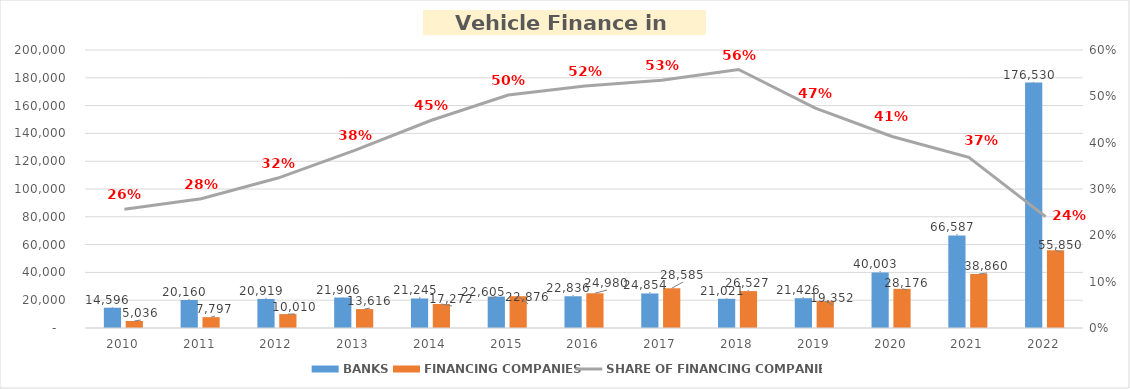
| Category | BANKS | FINANCING COMPANIES |
|---|---|---|
| 2010 | 14595.746 | 5035.89 |
| 2011 | 20160.143 | 7796.854 |
| 2012 | 20919.143 | 10009.755 |
| 2013 | 21905.99 | 13616.036 |
| 2014 | 21244.953 | 17271.844 |
| 2015 | 22605.033 | 22875.563 |
| 2016 | 22835.961 | 24980.231 |
| 2017 | 24853.571 | 28584.938 |
| 2018 | 21021.01 | 26527.133 |
| 2019 | 21426.278 | 19352.327 |
| 2020 | 40002.964 | 28176.3 |
| 2021 | 66586.576 | 38860.099 |
| 2022 | 176530.067 | 55850.334 |